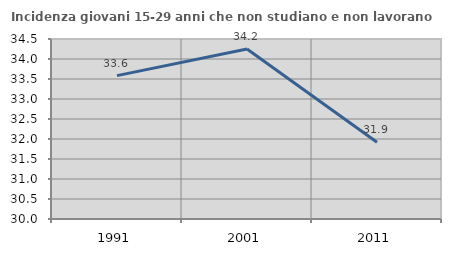
| Category | Incidenza giovani 15-29 anni che non studiano e non lavorano  |
|---|---|
| 1991.0 | 33.584 |
| 2001.0 | 34.249 |
| 2011.0 | 31.918 |